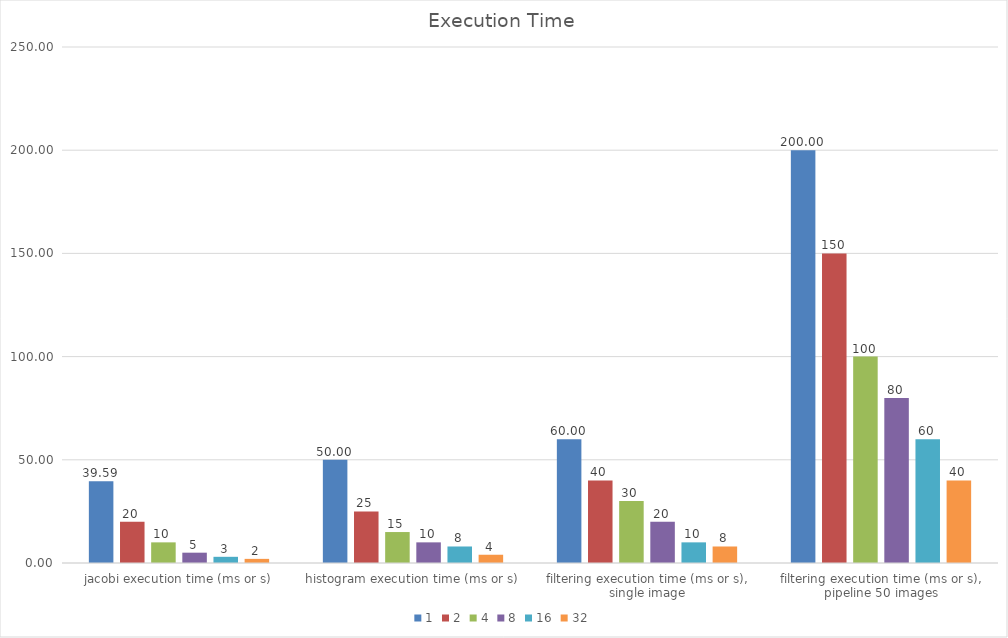
| Category | 1 | 2 | 4 | 8 | 16 | 32 |
|---|---|---|---|---|---|---|
| jacobi execution time (ms or s) | 39.59 | 20 | 10 | 5 | 3 | 2 |
| histogram execution time (ms or s) | 50 | 25 | 15 | 10 | 8 | 4 |
| filtering execution time (ms or s), single image | 60 | 40 | 30 | 20 | 10 | 8 |
| filtering execution time (ms or s), pipeline 50 images | 200 | 150 | 100 | 80 | 60 | 40 |